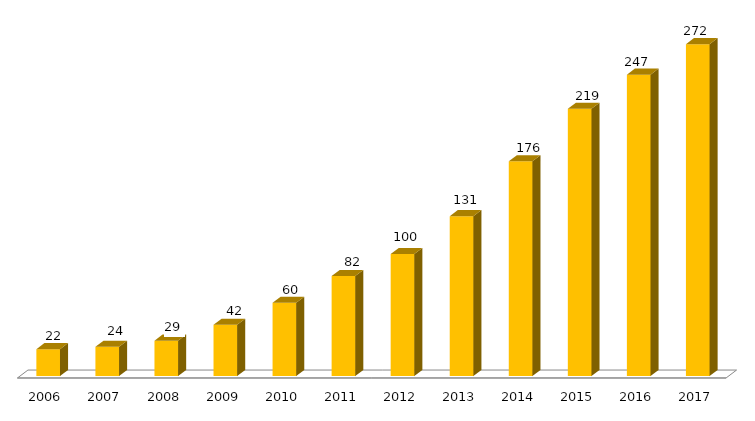
| Category | Programa |
|---|---|
| 2006.0 | 22 |
| 2007.0 | 24 |
| 2008.0 | 29 |
| 2009.0 | 42 |
| 2010.0 | 60 |
| 2011.0 | 82 |
| 2012.0 | 100 |
| 2013.0 | 131 |
| 2014.0 | 176 |
| 2015.0 | 219 |
| 2016.0 | 247 |
| 2017.0 | 272 |